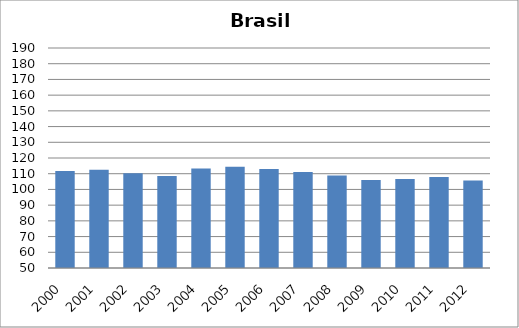
| Category | BCG |
|---|---|
| 2000.0 | 111.74 |
| 2001.0 | 112.6 |
| 2002.0 | 110.28 |
| 2003.0 | 108.47 |
| 2004.0 | 113.36 |
| 2005.0 | 114.48 |
| 2006.0 | 113.06 |
| 2007.0 | 111.08 |
| 2008.0 | 108.91 |
| 2009.0 | 105.98 |
| 2010.0 | 106.71 |
| 2011.0 | 107.94 |
| 2012.0 | 105.69 |